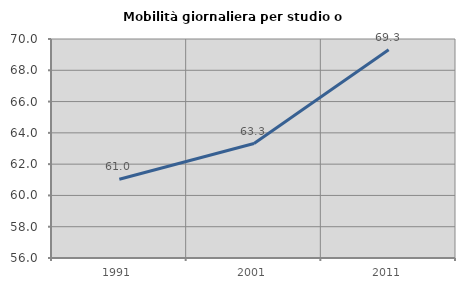
| Category | Mobilità giornaliera per studio o lavoro |
|---|---|
| 1991.0 | 61.037 |
| 2001.0 | 63.315 |
| 2011.0 | 69.307 |